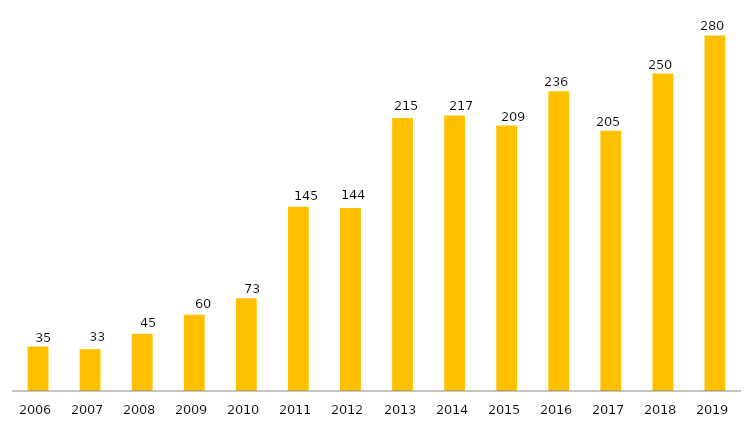
| Category | Mestrado |
|---|---|
| 2006.0 | 35 |
| 2007.0 | 33 |
| 2008.0 | 45 |
| 2009.0 | 60 |
| 2010.0 | 73 |
| 2011.0 | 145 |
| 2012.0 | 144 |
| 2013.0 | 215 |
| 2014.0 | 217 |
| 2015.0 | 209 |
| 2016.0 | 236 |
| 2017.0 | 205 |
| 2018.0 | 250 |
| 2019.0 | 280 |